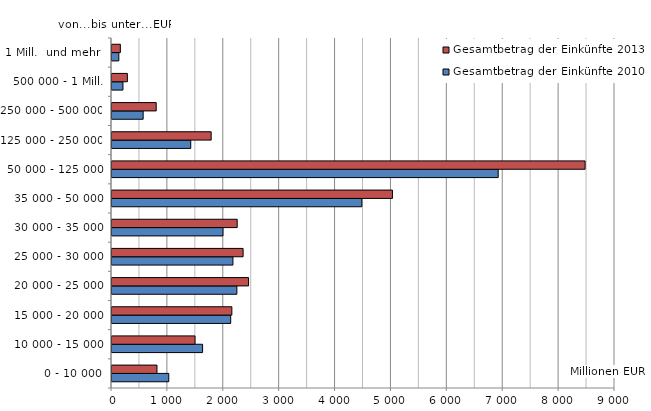
| Category | Gesamtbetrag der Einkünfte 2010 | Gesamtbetrag der Einkünfte 2013 |
|---|---|---|
| 0 - 10 000 | 1015828 | 804857 |
| 10 000 - 15 000 | 1620881 | 1485740 |
| 15 000 - 20 000 | 2123790 | 2144843 |
| 20 000 - 25 000 | 2234075 | 2443013 |
| 25 000 - 30 000 | 2163730 | 2345677 |
| 30 000 - 35 000 | 1986174 | 2240100 |
| 35 000 - 50 000 | 4469995 | 5018044 |
| 50 000 - 125 000 | 6910249 | 8464974 |
| 125 000 - 250 000 | 1408840 | 1774254 |
| 250 000 - 500 000 | 557318 | 791161 |
| 500 000 - 1 Mill. | 196193 | 274830 |
| 1 Mill.  und mehr  | 122201 | 149760 |